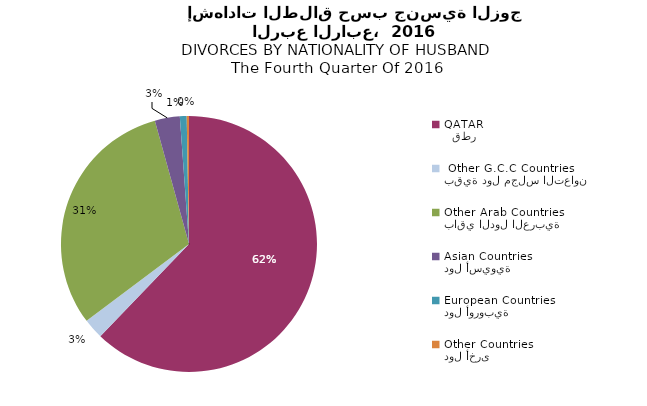
| Category | Series 1 |
|---|---|
|   قطر
QATAR | 217 |
| بقية دول مجلس التعاون
 Other G.C.C Countries | 9 |
| باقي الدول العربية
Other Arab Countries | 108 |
| دول أسيوية
Asian Countries | 11 |
| دول أوروبية
European Countries | 3 |
| دول أخرى
Other Countries | 1 |